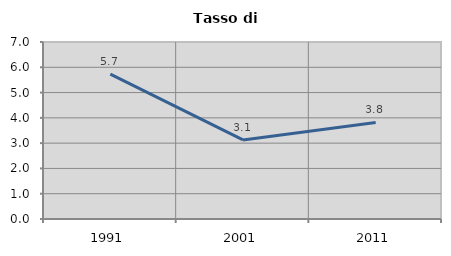
| Category | Tasso di disoccupazione   |
|---|---|
| 1991.0 | 5.732 |
| 2001.0 | 3.128 |
| 2011.0 | 3.818 |